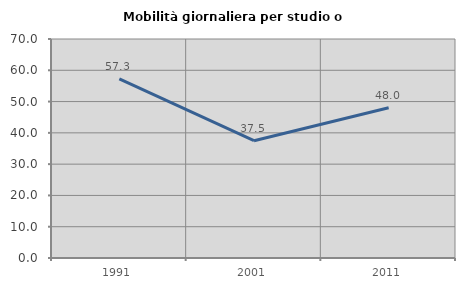
| Category | Mobilità giornaliera per studio o lavoro |
|---|---|
| 1991.0 | 57.273 |
| 2001.0 | 37.5 |
| 2011.0 | 48 |